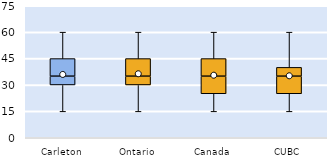
| Category | 25th | 50th | 75th |
|---|---|---|---|
| Carleton | 30 | 5 | 10 |
| Ontario | 30 | 5 | 10 |
| Canada | 25 | 10 | 10 |
| CUBC | 25 | 10 | 5 |